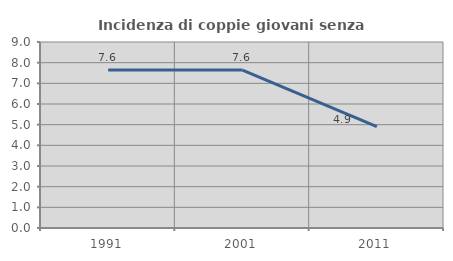
| Category | Incidenza di coppie giovani senza figli |
|---|---|
| 1991.0 | 7.641 |
| 2001.0 | 7.642 |
| 2011.0 | 4.91 |